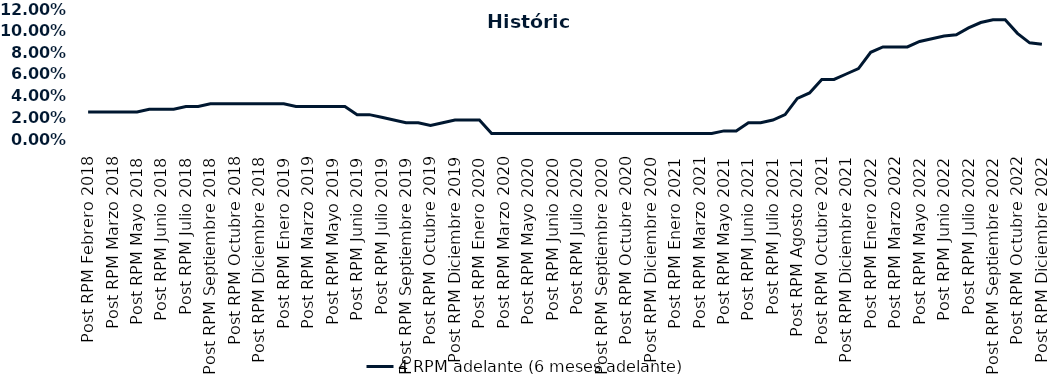
| Category | 4 RPM adelante (6 meses adelante) |
|---|---|
| Post RPM Febrero 2018 | 0.025 |
| Pre RPM Marzo 2018 | 0.025 |
| Post RPM Marzo 2018 | 0.025 |
| Pre RPM Mayo 2018 | 0.025 |
| Post RPM Mayo 2018 | 0.025 |
| Pre RPM Junio 2018 | 0.028 |
| Post RPM Junio 2018 | 0.028 |
| Pre RPM Julio 2018 | 0.028 |
| Post RPM Julio 2018 | 0.03 |
| Pre RPM Septiembre 2018 | 0.03 |
| Post RPM Septiembre 2018 | 0.032 |
| Pre RPM Octubre 2018 | 0.032 |
| Post RPM Octubre 2018 | 0.032 |
| Pre RPM Diciembre 2018 | 0.032 |
| Post RPM Diciembre 2018 | 0.032 |
| Pre RPM Enero 2019 | 0.032 |
| Post RPM Enero 2019 | 0.032 |
| Pre RPM Marzo 2019 | 0.03 |
| Post RPM Marzo 2019 | 0.03 |
| Pre RPM Mayo 2019 | 0.03 |
| Post RPM Mayo 2019 | 0.03 |
| Pre RPM Junio 2019 | 0.03 |
| Post RPM Junio 2019 | 0.022 |
| Pre RPM Julio 2019 | 0.022 |
| Post RPM Julio 2019 | 0.02 |
| Pre RPM Septiembre 2019 | 0.018 |
| Post RPM Septiembre 2019 | 0.015 |
| Pre RPM Octubre 2019 | 0.015 |
| Post RPM Octubre 2019 | 0.012 |
| Pre RPM Diciembre 2019 | 0.015 |
| Post RPM Diciembre 2019 | 0.018 |
| Pre RPM Enero 2020 | 0.018 |
| Post RPM Enero 2020 | 0.018 |
| Pre RPM Marzo 2020 | 0.005 |
| Post RPM Marzo 2020 | 0.005 |
| Pre RPM Mayo 2020 | 0.005 |
| Post RPM Mayo 2020 | 0.005 |
| Pre RPM Junio 2020 | 0.005 |
| Post RPM Junio 2020 | 0.005 |
| Pre RPM Julio 2020 | 0.005 |
| Post RPM Julio 2020 | 0.005 |
| Pre RPM Septiembre 2020 | 0.005 |
| Post RPM Septiembre 2020 | 0.005 |
| Pre RPM Octubre 2020 | 0.005 |
| Post RPM Octubre 2020 | 0.005 |
| Pre RPM Diciembre 2020 | 0.005 |
| Post RPM Diciembre 2020 | 0.005 |
| Pre RPM Enero 2021 | 0.005 |
| Post RPM Enero 2021 | 0.005 |
| Pre RPM Marzo 2021 | 0.005 |
| Post RPM Marzo 2021 | 0.005 |
| Pre RPM Mayo 2021 | 0.005 |
| Post RPM Mayo 2021 | 0.008 |
| Pre RPM Junio 2021 | 0.008 |
| Post RPM Junio 2021 | 0.015 |
| Pre RPM Julio 2021 | 0.015 |
| Post RPM Julio 2021 | 0.018 |
| Pre RPM Agosto 2021 | 0.022 |
| Post RPM Agosto 2021 | 0.038 |
| Pre RPM Octubre 2021 | 0.042 |
| Post RPM Octubre 2021 | 0.055 |
| Pre RPM Diciembre 2021 | 0.055 |
| Post RPM Diciembre 2021 | 0.06 |
| Pre RPM Enero 2022 | 0.065 |
| Post RPM Enero 2022 | 0.08 |
| Pre RPM Marzo 2022 | 0.085 |
| Post RPM Marzo 2022 | 0.085 |
| Pre RPM Mayo 2022 | 0.085 |
| Post RPM Mayo 2022 | 0.09 |
| Pre RPM Junio 2022 | 0.092 |
| Post RPM Junio 2022 | 0.095 |
| Pre RPM Julio 2022 | 0.096 |
| Post RPM Julio 2022 | 0.102 |
| Pre RPM Septiembre 2022 | 0.108 |
| Post RPM Septiembre 2022 | 0.11 |
| Pre RPM Octubre 2022 | 0.11 |
| Post RPM Octubre 2022 | 0.098 |
| Pre RPM Diciembre 2022 | 0.089 |
| Post RPM Diciembre 2022 | 0.088 |